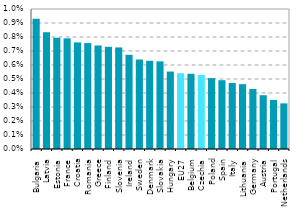
| Category | Series 0 |
|---|---|
| Bulgaria | 0.009 |
| Latvia | 0.008 |
| Estonia | 0.008 |
| France | 0.008 |
| Croatia | 0.008 |
| Romania | 0.008 |
| Greece | 0.007 |
| Finland | 0.007 |
| Slovenia | 0.007 |
| Ireland | 0.007 |
| Sweden | 0.006 |
| Denmark | 0.006 |
| Slovakia | 0.006 |
| Hungary | 0.006 |
| EU27 | 0.005 |
| Belgium | 0.005 |
| Czechia | 0.005 |
| Poland | 0.005 |
| Spain | 0.005 |
| Italy | 0.005 |
| Lithuania | 0.005 |
| Germany | 0.004 |
| Austria | 0.004 |
| Portugal | 0.004 |
| Netherlands | 0.003 |